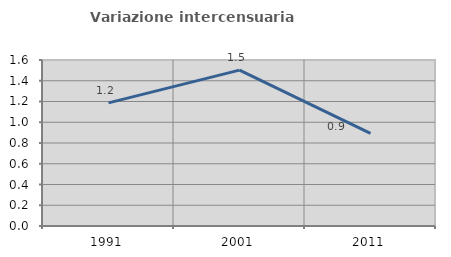
| Category | Variazione intercensuaria annua |
|---|---|
| 1991.0 | 1.187 |
| 2001.0 | 1.502 |
| 2011.0 | 0.892 |